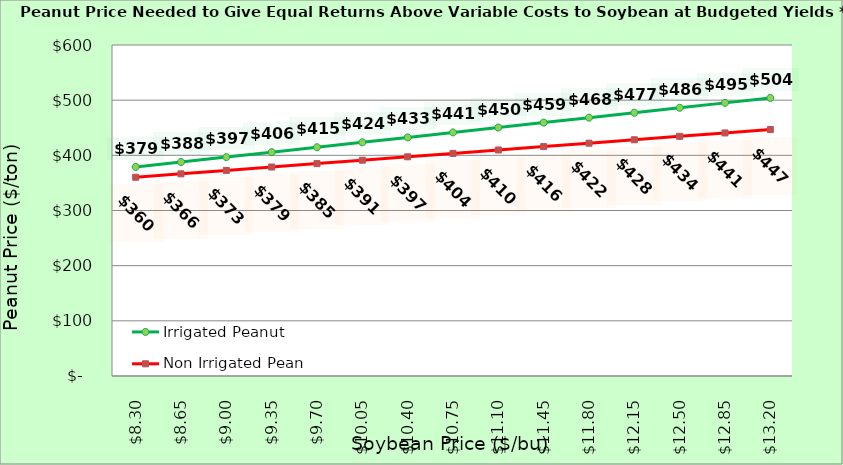
| Category | Irrigated Peanut | Non Irrigated Peanut |
|---|---|---|
| 8.300000000000002 | 378.918 | 360.28 |
| 8.650000000000002 | 387.855 | 366.456 |
| 9.000000000000002 | 396.791 | 372.633 |
| 9.350000000000001 | 405.727 | 378.809 |
| 9.700000000000001 | 414.663 | 384.985 |
| 10.05 | 423.599 | 391.162 |
| 10.4 | 432.535 | 397.338 |
| 10.75 | 441.472 | 403.515 |
| 11.1 | 450.408 | 409.691 |
| 11.45 | 459.344 | 415.868 |
| 11.799999999999999 | 468.28 | 422.044 |
| 12.149999999999999 | 477.216 | 428.221 |
| 12.499999999999998 | 486.152 | 434.397 |
| 12.849999999999998 | 495.089 | 440.574 |
| 13.199999999999998 | 504.025 | 446.75 |